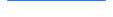
| Category | Series 0 |
|---|---|
| 0 | 83 |
| 1 | 95 |
| 2 | 85 |
| 3 | 84 |
| 4 | 74 |
| 5 | 77 |
| 6 | 67 |
| 7 | 68 |
| 8 | 70 |